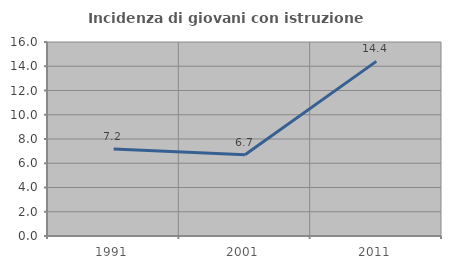
| Category | Incidenza di giovani con istruzione universitaria |
|---|---|
| 1991.0 | 7.174 |
| 2001.0 | 6.703 |
| 2011.0 | 14.4 |